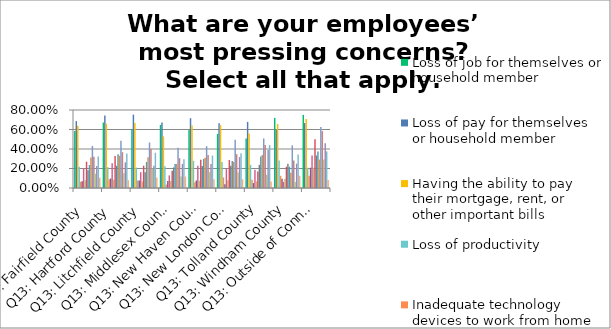
| Category | Loss of job for themselves or household member | Loss of pay for themselves or household member | Having the ability to pay their mortgage, rent, or other important bills | Loss of productivity | Inadequate technology devices to work from home | Inadequate internet service to work from home | Inadequate childcare | Inadequate space to work from home | Keeping children on track with school | Checking on family, friends, or colleagues | Searching for critical household items (food, medicine, toilet paper) | Understanding the magnitude of the pandemic's economic impact | Understanding the duration of the pandemic's economic impact | Understanding the effect of the pandemic on family's finances/investments | Access to healthcare/health insurance | Loss of social support/social isolation and/or mental health issues | Potential for workplace exposure to coronavirus | Other (please specify) |
|---|---|---|---|---|---|---|---|---|---|---|---|---|---|---|---|---|---|---|
| Q13: Fairfield County | 0.586 | 0.686 | 0.637 | 0.218 | 0.064 | 0.069 | 0.203 | 0.078 | 0.27 | 0.181 | 0.235 | 0.314 | 0.431 | 0.321 | 0.147 | 0.226 | 0.324 | 0.105 |
| Q13: Hartford County | 0.672 | 0.743 | 0.66 | 0.213 | 0.089 | 0.098 | 0.254 | 0.086 | 0.328 | 0.228 | 0.346 | 0.331 | 0.485 | 0.367 | 0.151 | 0.263 | 0.355 | 0.08 |
| Q13: Litchfield County | 0.6 | 0.752 | 0.667 | 0.21 | 0.076 | 0.076 | 0.162 | 0.067 | 0.229 | 0.162 | 0.267 | 0.314 | 0.467 | 0.4 | 0.2 | 0.229 | 0.362 | 0.105 |
| Q13: Middlesex County | 0.647 | 0.671 | 0.529 | 0.224 | 0.035 | 0.071 | 0.129 | 0.071 | 0.176 | 0.212 | 0.247 | 0.247 | 0.412 | 0.306 | 0.118 | 0.247 | 0.294 | 0.118 |
| Q13: New Haven County | 0.598 | 0.716 | 0.641 | 0.279 | 0.059 | 0.078 | 0.228 | 0.075 | 0.29 | 0.225 | 0.298 | 0.311 | 0.429 | 0.338 | 0.164 | 0.247 | 0.332 | 0.088 |
| Q13: New London County | 0.554 | 0.663 | 0.644 | 0.267 | 0.109 | 0.04 | 0.198 | 0.079 | 0.287 | 0.228 | 0.277 | 0.267 | 0.495 | 0.346 | 0.158 | 0.317 | 0.356 | 0.089 |
| Q13: Tolland County | 0.509 | 0.678 | 0.559 | 0.237 | 0.085 | 0.051 | 0.186 | 0.068 | 0.17 | 0.237 | 0.322 | 0.339 | 0.509 | 0.441 | 0.136 | 0.39 | 0.441 | 0.068 |
| Q13: Windham County | 0.719 | 0.594 | 0.656 | 0.281 | 0.125 | 0.094 | 0.062 | 0.094 | 0.219 | 0.25 | 0.219 | 0.156 | 0.438 | 0.281 | 0.062 | 0.25 | 0.344 | 0.125 |
| Q13: Outside of Connecticut | 0.75 | 0.667 | 0.708 | 0.208 | 0.125 | 0.208 | 0.333 | 0.208 | 0.5 | 0.333 | 0.375 | 0.292 | 0.625 | 0.583 | 0.292 | 0.458 | 0.375 | 0.083 |